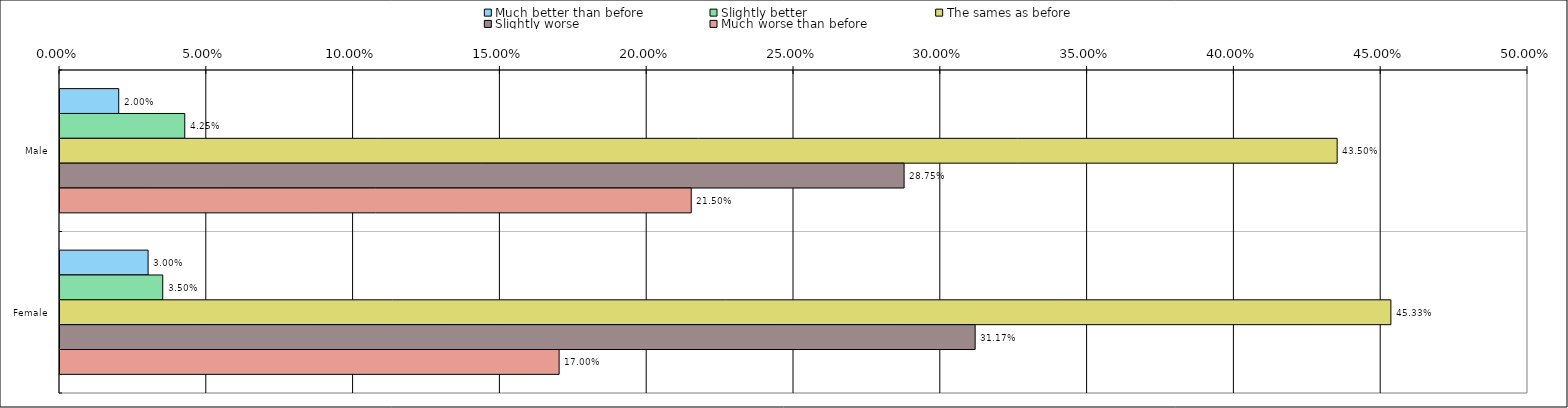
| Category | Much better than before | Slightly better | The sames as before | Slightly worse | Much worse than before |
|---|---|---|---|---|---|
| 0 | 0.02 | 0.042 | 0.435 | 0.288 | 0.215 |
| 1 | 0.03 | 0.035 | 0.453 | 0.312 | 0.17 |